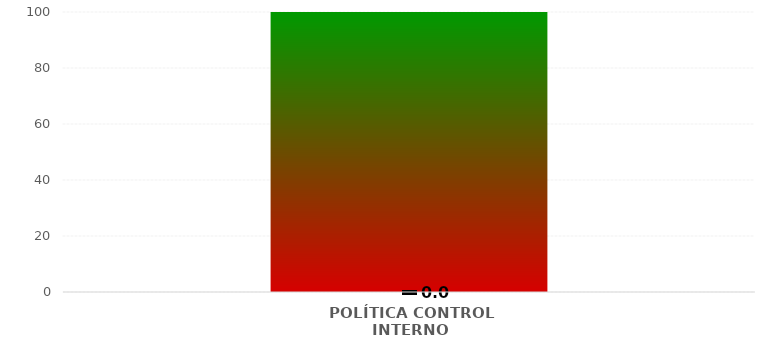
| Category | Niveles |
|---|---|
| POLÍTICA CONTROL INTERNO | 100 |